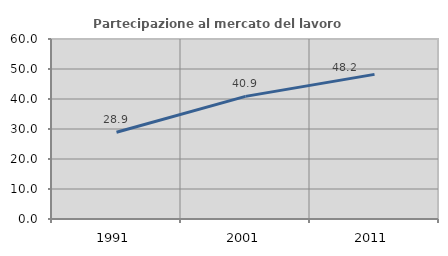
| Category | Partecipazione al mercato del lavoro  femminile |
|---|---|
| 1991.0 | 28.924 |
| 2001.0 | 40.871 |
| 2011.0 | 48.206 |